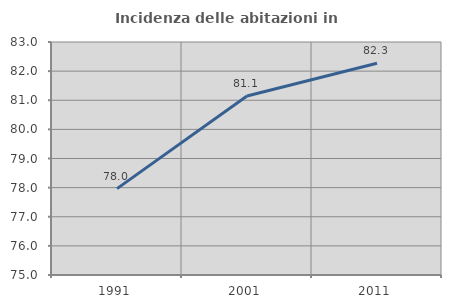
| Category | Incidenza delle abitazioni in proprietà  |
|---|---|
| 1991.0 | 77.966 |
| 2001.0 | 81.148 |
| 2011.0 | 82.271 |